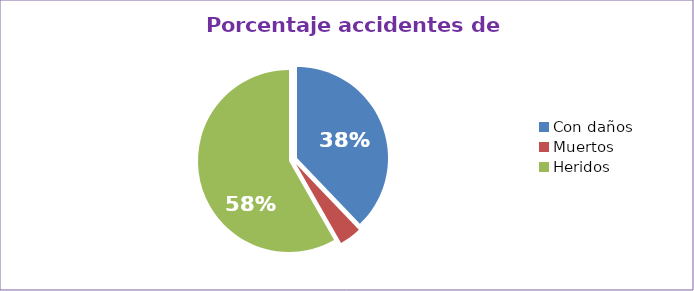
| Category | Series 0 |
|---|---|
| Con daños  | 37.864 |
| Muertos  | 3.883 |
| Heridos  | 58.252 |